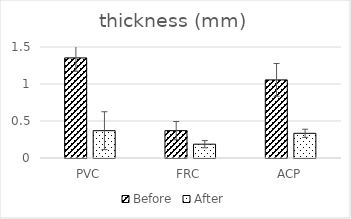
| Category | Before | After |
|---|---|---|
| PVC | 1.353 | 0.369 |
| FRC | 0.37 | 0.187 |
| ACP | 1.055 | 0.333 |